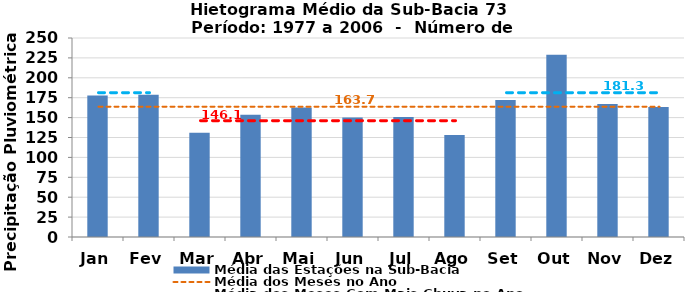
| Category | Média das Estações na Sub-Bacia |
|---|---|
| Jan | 177.828 |
| Fev | 178.772 |
| Mar | 130.922 |
| Abr | 153.626 |
| Mai | 162.736 |
| Jun | 150.212 |
| Jul | 150.732 |
| Ago | 128.128 |
| Set | 172.134 |
| Out | 228.856 |
| Nov | 166.964 |
| Dez | 163.268 |